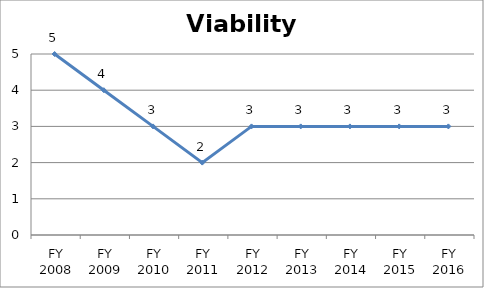
| Category | Viability score |
|---|---|
| FY 2016 | 3 |
| FY 2015 | 3 |
| FY 2014 | 3 |
| FY 2013 | 3 |
| FY 2012 | 3 |
| FY 2011 | 2 |
| FY 2010 | 3 |
| FY 2009 | 4 |
| FY 2008 | 5 |